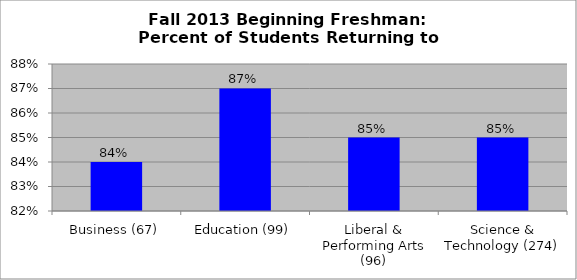
| Category | Series 0 |
|---|---|
| Business (67) | 0.84 |
| Education (99) | 0.87 |
| Liberal & Performing Arts (96) | 0.85 |
| Science & Technology (274) | 0.85 |